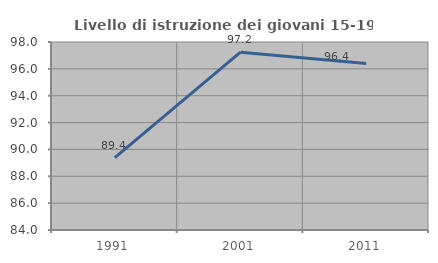
| Category | Livello di istruzione dei giovani 15-19 anni |
|---|---|
| 1991.0 | 89.387 |
| 2001.0 | 97.239 |
| 2011.0 | 96.403 |